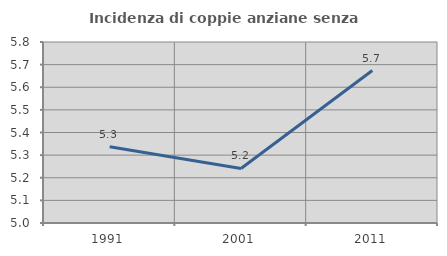
| Category | Incidenza di coppie anziane senza figli  |
|---|---|
| 1991.0 | 5.337 |
| 2001.0 | 5.241 |
| 2011.0 | 5.674 |